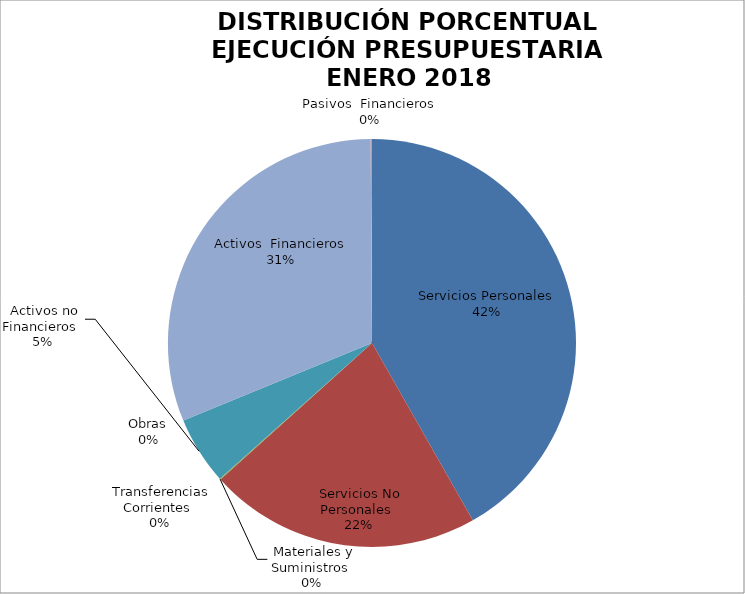
| Category | Series 0 | Series 1 |
|---|---|---|
| Servicios Personales | 10991719.45 | 1.105 |
| Servicios No Personales | 5671866.64 | 0.57 |
| Materiales y Suministros | 23017 | 0.002 |
| Transferencias Corrientes | 0 | 0 |
| Activos no Financieros | 1414296.57 | 0.142 |
| Obras | 0 | 0 |
| Activos  Financieros | -8185516.45 | -0.823 |
| Pasivos  Financieros | 27600 | 0.003 |